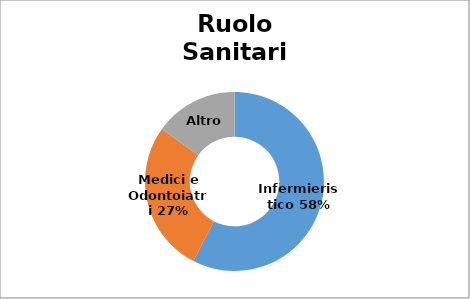
| Category | Series 0 |
|---|---|
| Infermieristico | 0.576 |
| Medici e Odontoiatri | 0.274 |
| Altro | 0.15 |